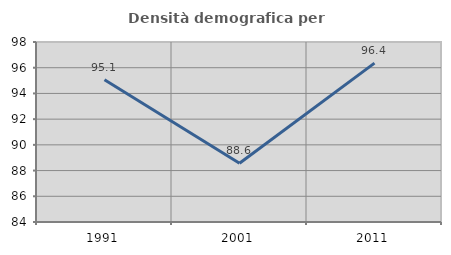
| Category | Densità demografica |
|---|---|
| 1991.0 | 95.071 |
| 2001.0 | 88.567 |
| 2011.0 | 96.356 |